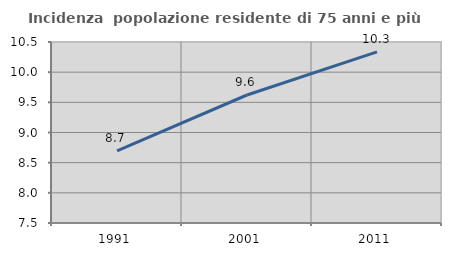
| Category | Incidenza  popolazione residente di 75 anni e più |
|---|---|
| 1991.0 | 8.697 |
| 2001.0 | 9.622 |
| 2011.0 | 10.337 |